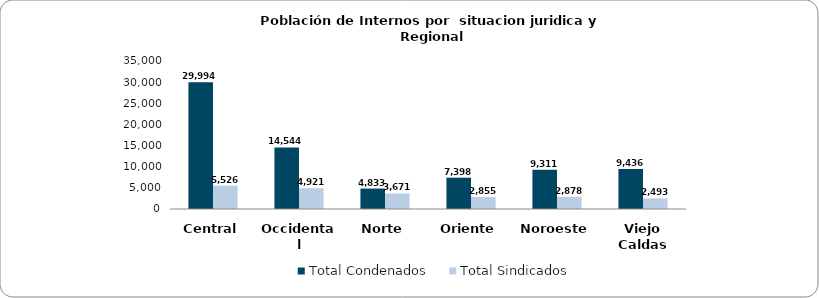
| Category | Total Condenados | Total Sindicados |
|---|---|---|
| Central | 29994 | 5526 |
| Occidental | 14544 | 4921 |
| Norte | 4833 | 3671 |
| Oriente | 7398 | 2855 |
| Noroeste | 9311 | 2878 |
| Viejo Caldas | 9436 | 2493 |